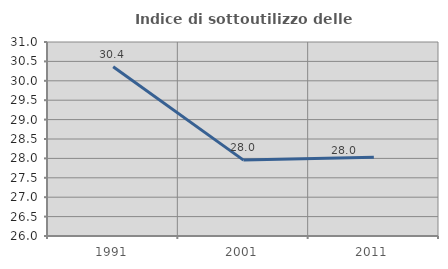
| Category | Indice di sottoutilizzo delle abitazioni  |
|---|---|
| 1991.0 | 30.364 |
| 2001.0 | 27.956 |
| 2011.0 | 28.027 |